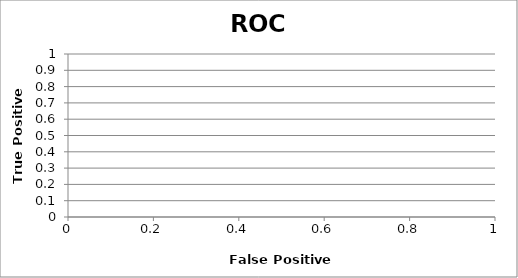
| Category | Series 0 |
|---|---|
| 0.0 | 0 |
| 0.0 | 0 |
| 0.0 | 0 |
| 0.0 | 0 |
| 0.0 | 0 |
| 0.0 | 0 |
| 0.0 | 0 |
| 0.0 | 0 |
| 0.0 | 0 |
| 0.0 | 0 |
| 0.0 | 0 |
| 0.0 | 0 |
| 0.0 | 0 |